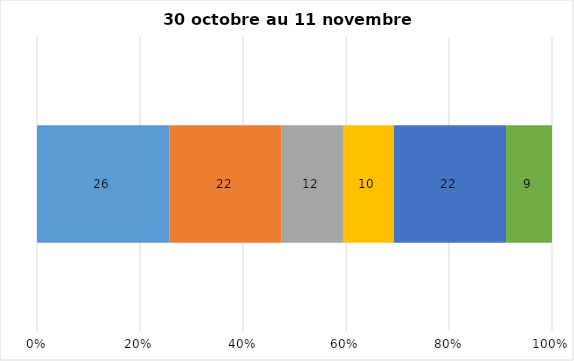
| Category | Plusieurs fois par jour | Une fois par jour | Quelques fois par semaine   | Une fois par semaine ou moins   |  Jamais   |  Je n’utilise pas les médias sociaux |
|---|---|---|---|---|---|---|
| 0 | 26 | 22 | 12 | 10 | 22 | 9 |